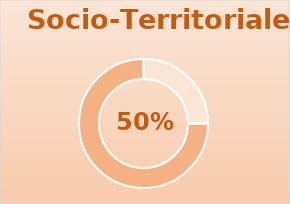
| Category | Series 0 |
|---|---|
| 0 | 1.5 |
| 1 | 0.5 |